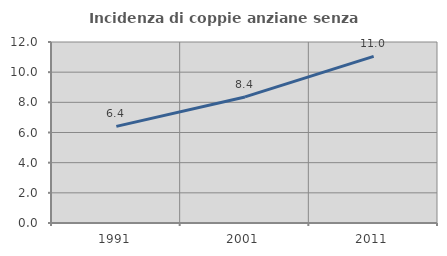
| Category | Incidenza di coppie anziane senza figli  |
|---|---|
| 1991.0 | 6.404 |
| 2001.0 | 8.358 |
| 2011.0 | 11.048 |